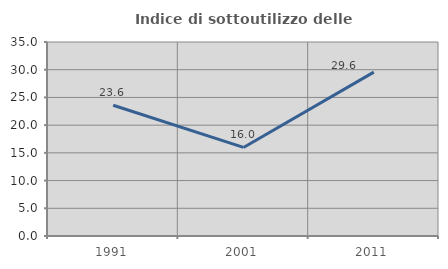
| Category | Indice di sottoutilizzo delle abitazioni  |
|---|---|
| 1991.0 | 23.58 |
| 2001.0 | 15.978 |
| 2011.0 | 29.559 |